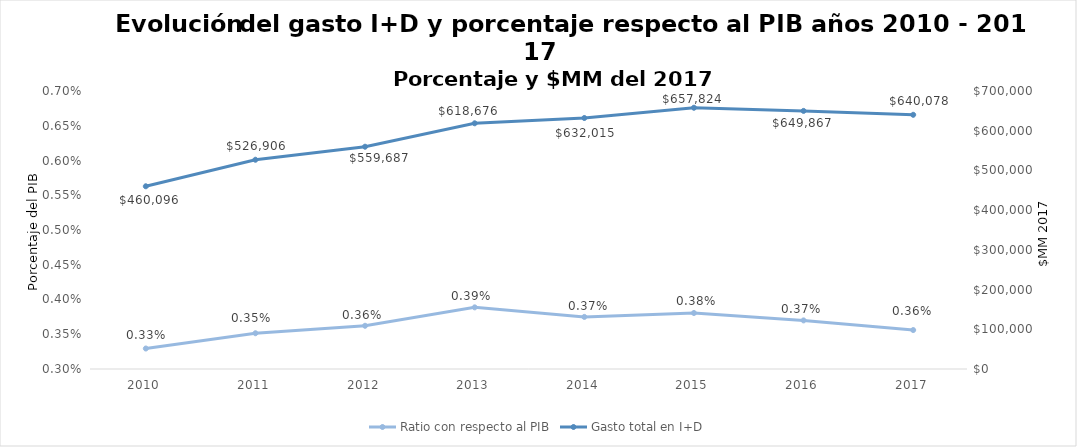
| Category | Ratio con respecto al PIB |
|---|---|
| 2010.0 | 0.003 |
| 2011.0 | 0.004 |
| 2012.0 | 0.004 |
| 2013.0 | 0.004 |
| 2014.0 | 0.004 |
| 2015.0 | 0.004 |
| 2016.0 | 0.004 |
| 2017.0 | 0.004 |